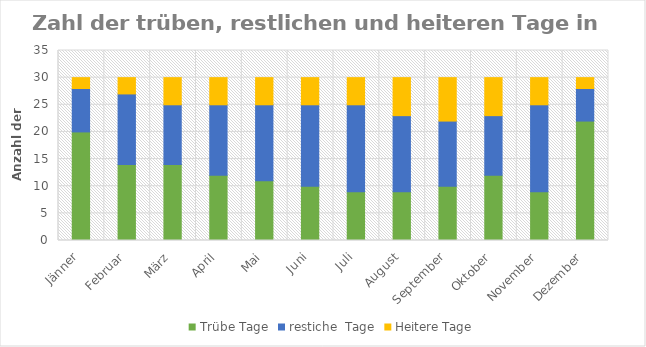
| Category | Trübe | restiche  | Heitere |
|---|---|---|---|
| Jänner | 20 | 8 | 2 |
| Februar | 14 | 13 | 3 |
| März | 14 | 11 | 5 |
| April | 12 | 13 | 5 |
| Mai | 11 | 14 | 5 |
| Juni | 10 | 15 | 5 |
| Juli | 9 | 16 | 5 |
| August | 9 | 14 | 7 |
| September | 10 | 12 | 8 |
| Oktober | 12 | 11 | 7 |
| November | 9 | 16 | 5 |
| Dezember | 22 | 6 | 2 |